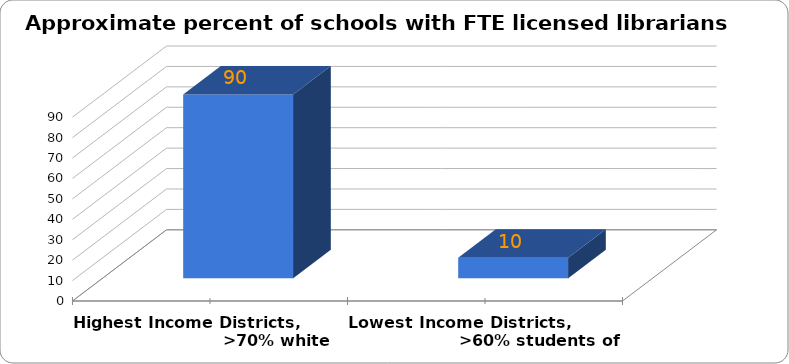
| Category | ~% of schools that have FTE librarians |
|---|---|
| Highest Income Districts,                              >70% white | 90 |
| Lowest Income Districts,                           >60% students of color  | 10 |